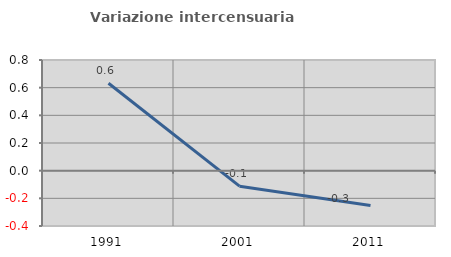
| Category | Variazione intercensuaria annua |
|---|---|
| 1991.0 | 0.632 |
| 2001.0 | -0.112 |
| 2011.0 | -0.252 |